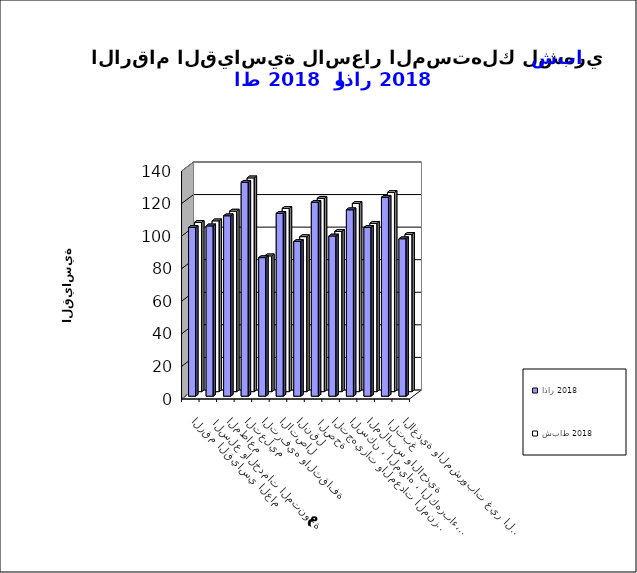
| Category | اذار 2018      | شباط 2018       |
|---|---|---|
| الاغذية والمشروبات غير الكحولية | 96.7 | 96.6 |
|  التبغ | 122.2 | 122.4 |
| الملابس والاحذية | 103.6 | 103.4 |
| السكن ، المياه ، الكهرباء، الغاز  | 114.5 | 115.6 |
| التجهيزات والمعدات المنزلية والصيانة | 98.4 | 98.4 |
|  الصحة | 119.1 | 118.8 |
| النقل | 95 | 95.2 |
| الاتصال | 112.3 | 112.6 |
| الترفيه والثقافة | 85.1 | 83.4 |
| التعليم | 131.4 | 131.3 |
| المطاعم  | 110.8 | 110.9 |
|  السلع والخدمات المتنوعة | 104.6 | 104.9 |
| الرقم القياسي العام | 103.7 | 104 |